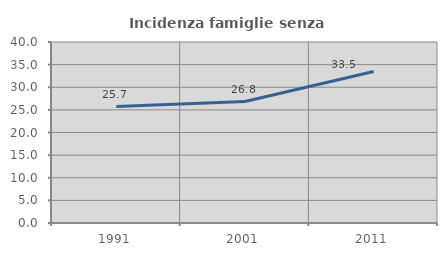
| Category | Incidenza famiglie senza nuclei |
|---|---|
| 1991.0 | 25.721 |
| 2001.0 | 26.838 |
| 2011.0 | 33.496 |